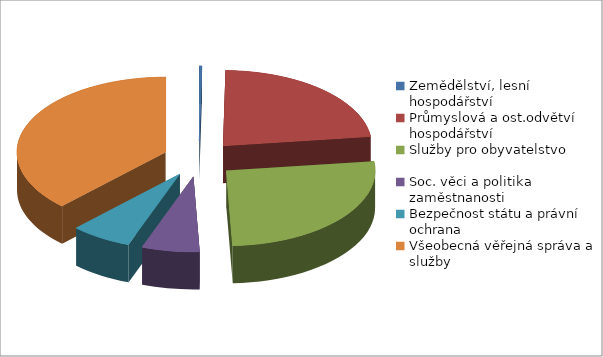
| Category | Series 0 |
|---|---|
| Zemědělství, lesní hospodářství | 16184 |
| Průmyslová a ost.odvětví hospodářství | 1386114 |
| Služby pro obyvatelstvo | 1600818 |
| Soc. věci a politika zaměstnanosti | 381745 |
| Bezpečnost státu a právní ochrana | 405534 |
| Všeobecná věřejná správa a služby | 2297632 |